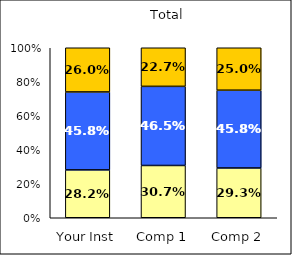
| Category | Low Job Satisfaction: Workplace | Average Job Satisfaction: Workplace | High Job Satisfaction: Workplace |
|---|---|---|---|
| Your Inst | 0.282 | 0.458 | 0.26 |
| Comp 1 | 0.307 | 0.465 | 0.227 |
| Comp 2 | 0.293 | 0.458 | 0.25 |